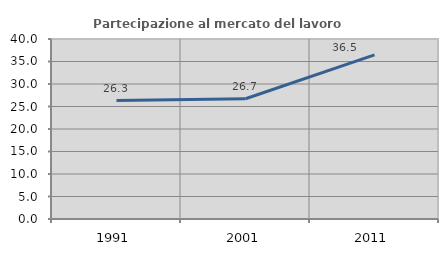
| Category | Partecipazione al mercato del lavoro  femminile |
|---|---|
| 1991.0 | 26.316 |
| 2001.0 | 26.721 |
| 2011.0 | 36.488 |